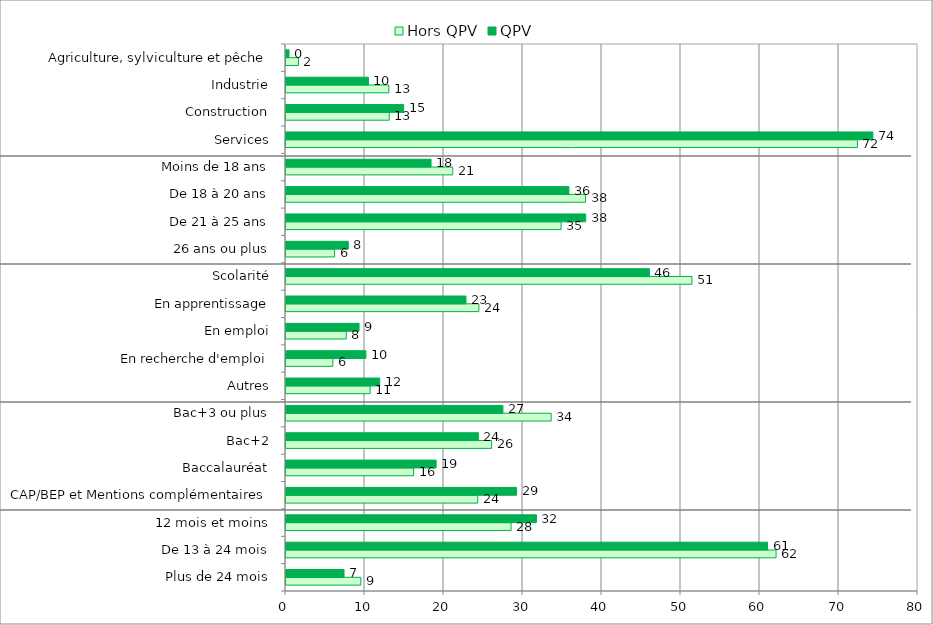
| Category | Hors QPV | QPV |
|---|---|---|
| Plus de 24 mois | 9.471 | 7.346 |
| De 13 à 24 mois | 62.035 | 60.952 |
| 12 mois et moins | 28.494 | 31.702 |
| CAP/BEP et Mentions complémentaires | 24.27 | 29.181 |
| Baccalauréat | 16.145 | 19.003 |
| Bac+2 | 26.022 | 24.359 |
| Bac+3 ou plus | 33.564 | 27.457 |
| Autres | 10.648 | 11.864 |
| En recherche d'emploi | 5.935 | 10.11 |
| En emploi | 7.624 | 9.248 |
| En apprentissage | 24.415 | 22.778 |
| Scolarité | 51.379 | 46 |
| 26 ans ou plus | 6.152 | 7.891 |
| De 21 à 25 ans | 34.826 | 37.937 |
| De 18 à 20 ans | 37.921 | 35.811 |
| Moins de 18 ans | 21.102 | 18.36 |
| Services | 72.332 | 74.29 |
| Construction | 13.069 | 14.897 |
| Industrie | 13.02 | 10.435 |
| Agriculture, sylviculture et pêche | 1.579 | 0.378 |